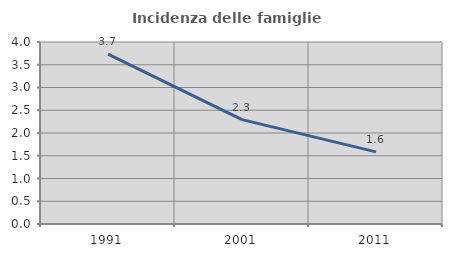
| Category | Incidenza delle famiglie numerose |
|---|---|
| 1991.0 | 3.735 |
| 2001.0 | 2.294 |
| 2011.0 | 1.585 |